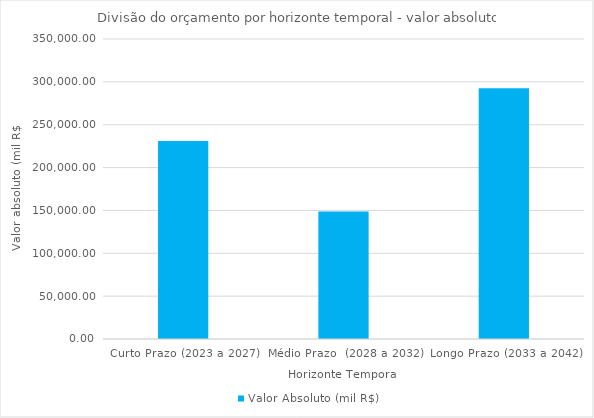
| Category | Valor Absoluto (mil R$) |
|---|---|
| Curto Prazo (2023 a 2027) | 231030.429 |
| Médio Prazo  (2028 a 2032) | 148781.036 |
| Longo Prazo (2033 a 2042) | 292488.473 |